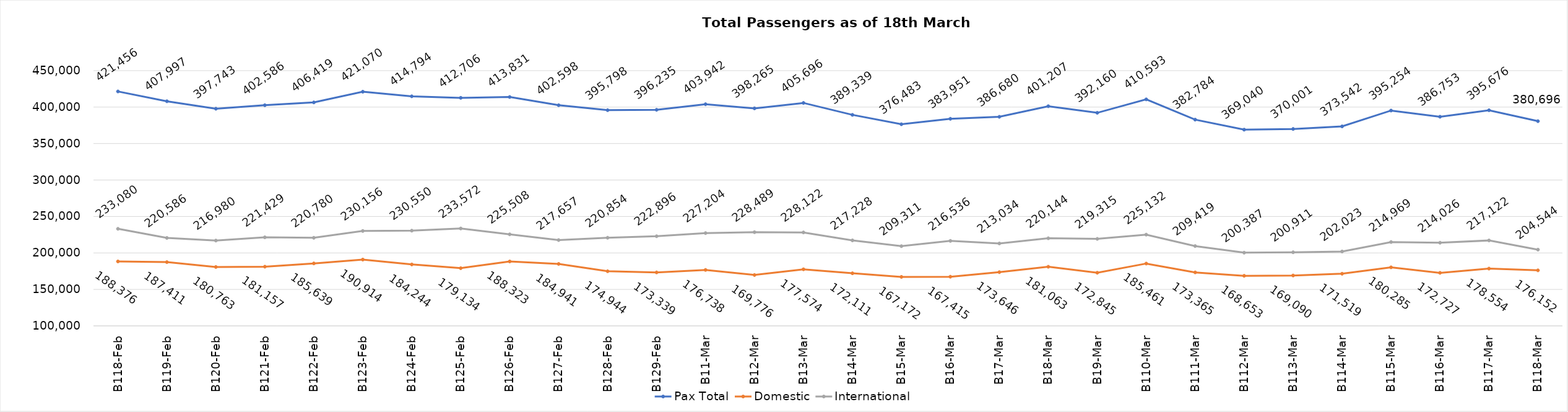
| Category | Pax Total | Domestic | International |
|---|---|---|---|
| 2024-02-18 | 421456 | 188376 | 233080 |
| 2024-02-19 | 407997 | 187411 | 220586 |
| 2024-02-20 | 397743 | 180763 | 216980 |
| 2024-02-21 | 402586 | 181157 | 221429 |
| 2024-02-22 | 406419 | 185639 | 220780 |
| 2024-02-23 | 421070 | 190914 | 230156 |
| 2024-02-24 | 414794 | 184244 | 230550 |
| 2024-02-25 | 412706 | 179134 | 233572 |
| 2024-02-26 | 413831 | 188323 | 225508 |
| 2024-02-27 | 402598 | 184941 | 217657 |
| 2024-02-28 | 395798 | 174944 | 220854 |
| 2024-02-29 | 396235 | 173339 | 222896 |
| 2024-03-01 | 403942 | 176738 | 227204 |
| 2024-03-02 | 398265 | 169776 | 228489 |
| 2024-03-03 | 405696 | 177574 | 228122 |
| 2024-03-04 | 389339 | 172111 | 217228 |
| 2024-03-05 | 376483 | 167172 | 209311 |
| 2024-03-06 | 383951 | 167415 | 216536 |
| 2024-03-07 | 386680 | 173646 | 213034 |
| 2024-03-08 | 401207 | 181063 | 220144 |
| 2024-03-09 | 392160 | 172845 | 219315 |
| 2024-03-10 | 410593 | 185461 | 225132 |
| 2024-03-11 | 382784 | 173365 | 209419 |
| 2024-03-12 | 369040 | 168653 | 200387 |
| 2024-03-13 | 370001 | 169090 | 200911 |
| 2024-03-14 | 373542 | 171519 | 202023 |
| 2024-03-15 | 395254 | 180285 | 214969 |
| 2024-03-16 | 386753 | 172727 | 214026 |
| 2024-03-17 | 395676 | 178554 | 217122 |
| 2024-03-18 | 380696 | 176152 | 204544 |